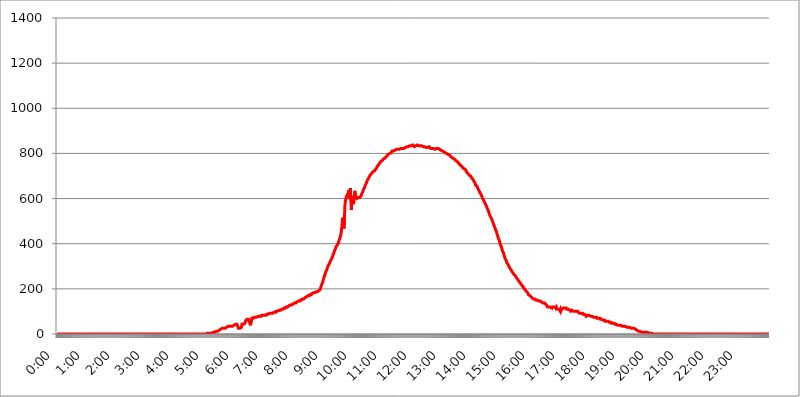
| Category | 2017.07.29. Intenzitás [W/m^2] |
|---|---|
| 0.0 | 0 |
| 0.0006944444444444445 | 0 |
| 0.001388888888888889 | 0 |
| 0.0020833333333333333 | 0 |
| 0.002777777777777778 | 0 |
| 0.003472222222222222 | 0 |
| 0.004166666666666667 | 0 |
| 0.004861111111111111 | 0 |
| 0.005555555555555556 | 0 |
| 0.0062499999999999995 | 0 |
| 0.006944444444444444 | 0 |
| 0.007638888888888889 | 0 |
| 0.008333333333333333 | 0 |
| 0.009027777777777779 | 0 |
| 0.009722222222222222 | 0 |
| 0.010416666666666666 | 0 |
| 0.011111111111111112 | 0 |
| 0.011805555555555555 | 0 |
| 0.012499999999999999 | 0 |
| 0.013194444444444444 | 0 |
| 0.013888888888888888 | 0 |
| 0.014583333333333332 | 0 |
| 0.015277777777777777 | 0 |
| 0.015972222222222224 | 0 |
| 0.016666666666666666 | 0 |
| 0.017361111111111112 | 0 |
| 0.018055555555555557 | 0 |
| 0.01875 | 0 |
| 0.019444444444444445 | 0 |
| 0.02013888888888889 | 0 |
| 0.020833333333333332 | 0 |
| 0.02152777777777778 | 0 |
| 0.022222222222222223 | 0 |
| 0.02291666666666667 | 0 |
| 0.02361111111111111 | 0 |
| 0.024305555555555556 | 0 |
| 0.024999999999999998 | 0 |
| 0.025694444444444447 | 0 |
| 0.02638888888888889 | 0 |
| 0.027083333333333334 | 0 |
| 0.027777777777777776 | 0 |
| 0.02847222222222222 | 0 |
| 0.029166666666666664 | 0 |
| 0.029861111111111113 | 0 |
| 0.030555555555555555 | 0 |
| 0.03125 | 0 |
| 0.03194444444444445 | 0 |
| 0.03263888888888889 | 0 |
| 0.03333333333333333 | 0 |
| 0.034027777777777775 | 0 |
| 0.034722222222222224 | 0 |
| 0.035416666666666666 | 0 |
| 0.036111111111111115 | 0 |
| 0.03680555555555556 | 0 |
| 0.0375 | 0 |
| 0.03819444444444444 | 0 |
| 0.03888888888888889 | 0 |
| 0.03958333333333333 | 0 |
| 0.04027777777777778 | 0 |
| 0.04097222222222222 | 0 |
| 0.041666666666666664 | 0 |
| 0.042361111111111106 | 0 |
| 0.04305555555555556 | 0 |
| 0.043750000000000004 | 0 |
| 0.044444444444444446 | 0 |
| 0.04513888888888889 | 0 |
| 0.04583333333333334 | 0 |
| 0.04652777777777778 | 0 |
| 0.04722222222222222 | 0 |
| 0.04791666666666666 | 0 |
| 0.04861111111111111 | 0 |
| 0.049305555555555554 | 0 |
| 0.049999999999999996 | 0 |
| 0.05069444444444445 | 0 |
| 0.051388888888888894 | 0 |
| 0.052083333333333336 | 0 |
| 0.05277777777777778 | 0 |
| 0.05347222222222222 | 0 |
| 0.05416666666666667 | 0 |
| 0.05486111111111111 | 0 |
| 0.05555555555555555 | 0 |
| 0.05625 | 0 |
| 0.05694444444444444 | 0 |
| 0.057638888888888885 | 0 |
| 0.05833333333333333 | 0 |
| 0.05902777777777778 | 0 |
| 0.059722222222222225 | 0 |
| 0.06041666666666667 | 0 |
| 0.061111111111111116 | 0 |
| 0.06180555555555556 | 0 |
| 0.0625 | 0 |
| 0.06319444444444444 | 0 |
| 0.06388888888888888 | 0 |
| 0.06458333333333334 | 0 |
| 0.06527777777777778 | 0 |
| 0.06597222222222222 | 0 |
| 0.06666666666666667 | 0 |
| 0.06736111111111111 | 0 |
| 0.06805555555555555 | 0 |
| 0.06874999999999999 | 0 |
| 0.06944444444444443 | 0 |
| 0.07013888888888889 | 0 |
| 0.07083333333333333 | 0 |
| 0.07152777777777779 | 0 |
| 0.07222222222222223 | 0 |
| 0.07291666666666667 | 0 |
| 0.07361111111111111 | 0 |
| 0.07430555555555556 | 0 |
| 0.075 | 0 |
| 0.07569444444444444 | 0 |
| 0.0763888888888889 | 0 |
| 0.07708333333333334 | 0 |
| 0.07777777777777778 | 0 |
| 0.07847222222222222 | 0 |
| 0.07916666666666666 | 0 |
| 0.0798611111111111 | 0 |
| 0.08055555555555556 | 0 |
| 0.08125 | 0 |
| 0.08194444444444444 | 0 |
| 0.08263888888888889 | 0 |
| 0.08333333333333333 | 0 |
| 0.08402777777777777 | 0 |
| 0.08472222222222221 | 0 |
| 0.08541666666666665 | 0 |
| 0.08611111111111112 | 0 |
| 0.08680555555555557 | 0 |
| 0.08750000000000001 | 0 |
| 0.08819444444444445 | 0 |
| 0.08888888888888889 | 0 |
| 0.08958333333333333 | 0 |
| 0.09027777777777778 | 0 |
| 0.09097222222222222 | 0 |
| 0.09166666666666667 | 0 |
| 0.09236111111111112 | 0 |
| 0.09305555555555556 | 0 |
| 0.09375 | 0 |
| 0.09444444444444444 | 0 |
| 0.09513888888888888 | 0 |
| 0.09583333333333333 | 0 |
| 0.09652777777777777 | 0 |
| 0.09722222222222222 | 0 |
| 0.09791666666666667 | 0 |
| 0.09861111111111111 | 0 |
| 0.09930555555555555 | 0 |
| 0.09999999999999999 | 0 |
| 0.10069444444444443 | 0 |
| 0.1013888888888889 | 0 |
| 0.10208333333333335 | 0 |
| 0.10277777777777779 | 0 |
| 0.10347222222222223 | 0 |
| 0.10416666666666667 | 0 |
| 0.10486111111111111 | 0 |
| 0.10555555555555556 | 0 |
| 0.10625 | 0 |
| 0.10694444444444444 | 0 |
| 0.1076388888888889 | 0 |
| 0.10833333333333334 | 0 |
| 0.10902777777777778 | 0 |
| 0.10972222222222222 | 0 |
| 0.1111111111111111 | 0 |
| 0.11180555555555556 | 0 |
| 0.11180555555555556 | 0 |
| 0.1125 | 0 |
| 0.11319444444444444 | 0 |
| 0.11388888888888889 | 0 |
| 0.11458333333333333 | 0 |
| 0.11527777777777777 | 0 |
| 0.11597222222222221 | 0 |
| 0.11666666666666665 | 0 |
| 0.1173611111111111 | 0 |
| 0.11805555555555557 | 0 |
| 0.11944444444444445 | 0 |
| 0.12013888888888889 | 0 |
| 0.12083333333333333 | 0 |
| 0.12152777777777778 | 0 |
| 0.12222222222222223 | 0 |
| 0.12291666666666667 | 0 |
| 0.12291666666666667 | 0 |
| 0.12361111111111112 | 0 |
| 0.12430555555555556 | 0 |
| 0.125 | 0 |
| 0.12569444444444444 | 0 |
| 0.12638888888888888 | 0 |
| 0.12708333333333333 | 0 |
| 0.16875 | 0 |
| 0.12847222222222224 | 0 |
| 0.12916666666666668 | 0 |
| 0.12986111111111112 | 0 |
| 0.13055555555555556 | 0 |
| 0.13125 | 0 |
| 0.13194444444444445 | 0 |
| 0.1326388888888889 | 0 |
| 0.13333333333333333 | 0 |
| 0.13402777777777777 | 0 |
| 0.13402777777777777 | 0 |
| 0.13472222222222222 | 0 |
| 0.13541666666666666 | 0 |
| 0.1361111111111111 | 0 |
| 0.13749999999999998 | 0 |
| 0.13819444444444443 | 0 |
| 0.1388888888888889 | 0 |
| 0.13958333333333334 | 0 |
| 0.14027777777777778 | 0 |
| 0.14097222222222222 | 0 |
| 0.14166666666666666 | 0 |
| 0.1423611111111111 | 0 |
| 0.14305555555555557 | 0 |
| 0.14375000000000002 | 0 |
| 0.14444444444444446 | 0 |
| 0.1451388888888889 | 0 |
| 0.1451388888888889 | 0 |
| 0.14652777777777778 | 0 |
| 0.14722222222222223 | 0 |
| 0.14791666666666667 | 0 |
| 0.1486111111111111 | 0 |
| 0.14930555555555555 | 0 |
| 0.15 | 0 |
| 0.15069444444444444 | 0 |
| 0.15138888888888888 | 0 |
| 0.15208333333333332 | 0 |
| 0.15277777777777776 | 0 |
| 0.15347222222222223 | 0 |
| 0.15416666666666667 | 0 |
| 0.15486111111111112 | 0 |
| 0.15555555555555556 | 0 |
| 0.15625 | 0 |
| 0.15694444444444444 | 0 |
| 0.15763888888888888 | 0 |
| 0.15833333333333333 | 0 |
| 0.15902777777777777 | 0 |
| 0.15972222222222224 | 0 |
| 0.16041666666666668 | 0 |
| 0.16111111111111112 | 0 |
| 0.16180555555555556 | 0 |
| 0.1625 | 0 |
| 0.16319444444444445 | 0 |
| 0.1638888888888889 | 0 |
| 0.16458333333333333 | 0 |
| 0.16527777777777777 | 0 |
| 0.16597222222222222 | 0 |
| 0.16666666666666666 | 0 |
| 0.1673611111111111 | 0 |
| 0.16805555555555554 | 0 |
| 0.16874999999999998 | 0 |
| 0.16944444444444443 | 0 |
| 0.17013888888888887 | 0 |
| 0.1708333333333333 | 0 |
| 0.17152777777777775 | 0 |
| 0.17222222222222225 | 0 |
| 0.1729166666666667 | 0 |
| 0.17361111111111113 | 0 |
| 0.17430555555555557 | 0 |
| 0.17500000000000002 | 0 |
| 0.17569444444444446 | 0 |
| 0.1763888888888889 | 0 |
| 0.17708333333333334 | 0 |
| 0.17777777777777778 | 0 |
| 0.17847222222222223 | 0 |
| 0.17916666666666667 | 0 |
| 0.1798611111111111 | 0 |
| 0.18055555555555555 | 0 |
| 0.18125 | 0 |
| 0.18194444444444444 | 0 |
| 0.1826388888888889 | 0 |
| 0.18333333333333335 | 0 |
| 0.1840277777777778 | 0 |
| 0.18472222222222223 | 0 |
| 0.18541666666666667 | 0 |
| 0.18611111111111112 | 0 |
| 0.18680555555555556 | 0 |
| 0.1875 | 0 |
| 0.18819444444444444 | 0 |
| 0.18888888888888888 | 0 |
| 0.18958333333333333 | 0 |
| 0.19027777777777777 | 0 |
| 0.1909722222222222 | 0 |
| 0.19166666666666665 | 0 |
| 0.19236111111111112 | 0 |
| 0.19305555555555554 | 0 |
| 0.19375 | 0 |
| 0.19444444444444445 | 0 |
| 0.1951388888888889 | 0 |
| 0.19583333333333333 | 0 |
| 0.19652777777777777 | 0 |
| 0.19722222222222222 | 0 |
| 0.19791666666666666 | 0 |
| 0.1986111111111111 | 0 |
| 0.19930555555555554 | 0 |
| 0.19999999999999998 | 0 |
| 0.20069444444444443 | 0 |
| 0.20138888888888887 | 0 |
| 0.2020833333333333 | 0 |
| 0.2027777777777778 | 0 |
| 0.2034722222222222 | 0 |
| 0.2041666666666667 | 0 |
| 0.20486111111111113 | 0 |
| 0.20555555555555557 | 0 |
| 0.20625000000000002 | 0 |
| 0.20694444444444446 | 0 |
| 0.2076388888888889 | 0 |
| 0.20833333333333334 | 0 |
| 0.20902777777777778 | 0 |
| 0.20972222222222223 | 3.525 |
| 0.21041666666666667 | 3.525 |
| 0.2111111111111111 | 3.525 |
| 0.21180555555555555 | 3.525 |
| 0.2125 | 3.525 |
| 0.21319444444444444 | 3.525 |
| 0.2138888888888889 | 3.525 |
| 0.21458333333333335 | 3.525 |
| 0.2152777777777778 | 3.525 |
| 0.21597222222222223 | 3.525 |
| 0.21666666666666667 | 3.525 |
| 0.21736111111111112 | 3.525 |
| 0.21805555555555556 | 3.525 |
| 0.21875 | 7.887 |
| 0.21944444444444444 | 7.887 |
| 0.22013888888888888 | 7.887 |
| 0.22083333333333333 | 7.887 |
| 0.22152777777777777 | 12.257 |
| 0.2222222222222222 | 12.257 |
| 0.22291666666666665 | 12.257 |
| 0.2236111111111111 | 12.257 |
| 0.22430555555555556 | 12.257 |
| 0.225 | 12.257 |
| 0.22569444444444445 | 16.636 |
| 0.2263888888888889 | 16.636 |
| 0.22708333333333333 | 16.636 |
| 0.22777777777777777 | 16.636 |
| 0.22847222222222222 | 21.024 |
| 0.22916666666666666 | 21.024 |
| 0.2298611111111111 | 21.024 |
| 0.23055555555555554 | 21.024 |
| 0.23124999999999998 | 25.419 |
| 0.23194444444444443 | 25.419 |
| 0.23263888888888887 | 25.419 |
| 0.2333333333333333 | 25.419 |
| 0.2340277777777778 | 25.419 |
| 0.2347222222222222 | 25.419 |
| 0.2354166666666667 | 25.419 |
| 0.23611111111111113 | 25.419 |
| 0.23680555555555557 | 25.419 |
| 0.23750000000000002 | 29.823 |
| 0.23819444444444446 | 34.234 |
| 0.2388888888888889 | 34.234 |
| 0.23958333333333334 | 34.234 |
| 0.24027777777777778 | 34.234 |
| 0.24097222222222223 | 34.234 |
| 0.24166666666666667 | 34.234 |
| 0.2423611111111111 | 34.234 |
| 0.24305555555555555 | 34.234 |
| 0.24375 | 34.234 |
| 0.24444444444444446 | 34.234 |
| 0.24513888888888888 | 34.234 |
| 0.24583333333333335 | 34.234 |
| 0.2465277777777778 | 38.653 |
| 0.24722222222222223 | 38.653 |
| 0.24791666666666667 | 38.653 |
| 0.24861111111111112 | 43.079 |
| 0.24930555555555556 | 43.079 |
| 0.25 | 43.079 |
| 0.25069444444444444 | 43.079 |
| 0.2513888888888889 | 43.079 |
| 0.2520833333333333 | 43.079 |
| 0.25277777777777777 | 43.079 |
| 0.2534722222222222 | 43.079 |
| 0.25416666666666665 | 25.419 |
| 0.2548611111111111 | 21.024 |
| 0.2555555555555556 | 21.024 |
| 0.25625000000000003 | 25.419 |
| 0.2569444444444445 | 21.024 |
| 0.2576388888888889 | 29.823 |
| 0.25833333333333336 | 29.823 |
| 0.2590277777777778 | 43.079 |
| 0.25972222222222224 | 38.653 |
| 0.2604166666666667 | 43.079 |
| 0.2611111111111111 | 43.079 |
| 0.26180555555555557 | 38.653 |
| 0.2625 | 38.653 |
| 0.26319444444444445 | 47.511 |
| 0.2638888888888889 | 56.398 |
| 0.26458333333333334 | 56.398 |
| 0.2652777777777778 | 56.398 |
| 0.2659722222222222 | 65.31 |
| 0.26666666666666666 | 65.31 |
| 0.2673611111111111 | 65.31 |
| 0.26805555555555555 | 65.31 |
| 0.26875 | 65.31 |
| 0.26944444444444443 | 65.31 |
| 0.2701388888888889 | 47.511 |
| 0.2708333333333333 | 38.653 |
| 0.27152777777777776 | 38.653 |
| 0.2722222222222222 | 56.398 |
| 0.27291666666666664 | 69.775 |
| 0.2736111111111111 | 69.775 |
| 0.2743055555555555 | 69.775 |
| 0.27499999999999997 | 69.775 |
| 0.27569444444444446 | 74.246 |
| 0.27638888888888885 | 74.246 |
| 0.27708333333333335 | 74.246 |
| 0.2777777777777778 | 74.246 |
| 0.27847222222222223 | 74.246 |
| 0.2791666666666667 | 74.246 |
| 0.2798611111111111 | 74.246 |
| 0.28055555555555556 | 74.246 |
| 0.28125 | 74.246 |
| 0.28194444444444444 | 78.722 |
| 0.2826388888888889 | 78.722 |
| 0.2833333333333333 | 78.722 |
| 0.28402777777777777 | 78.722 |
| 0.2847222222222222 | 78.722 |
| 0.28541666666666665 | 78.722 |
| 0.28611111111111115 | 78.722 |
| 0.28680555555555554 | 83.205 |
| 0.28750000000000003 | 83.205 |
| 0.2881944444444445 | 83.205 |
| 0.2888888888888889 | 83.205 |
| 0.28958333333333336 | 83.205 |
| 0.2902777777777778 | 83.205 |
| 0.29097222222222224 | 83.205 |
| 0.2916666666666667 | 83.205 |
| 0.2923611111111111 | 83.205 |
| 0.29305555555555557 | 83.205 |
| 0.29375 | 87.692 |
| 0.29444444444444445 | 87.692 |
| 0.2951388888888889 | 87.692 |
| 0.29583333333333334 | 87.692 |
| 0.2965277777777778 | 87.692 |
| 0.2972222222222222 | 87.692 |
| 0.29791666666666666 | 92.184 |
| 0.2986111111111111 | 92.184 |
| 0.29930555555555555 | 92.184 |
| 0.3 | 92.184 |
| 0.30069444444444443 | 92.184 |
| 0.3013888888888889 | 92.184 |
| 0.3020833333333333 | 92.184 |
| 0.30277777777777776 | 92.184 |
| 0.3034722222222222 | 92.184 |
| 0.30416666666666664 | 96.682 |
| 0.3048611111111111 | 96.682 |
| 0.3055555555555555 | 96.682 |
| 0.30624999999999997 | 96.682 |
| 0.3069444444444444 | 101.184 |
| 0.3076388888888889 | 101.184 |
| 0.30833333333333335 | 101.184 |
| 0.3090277777777778 | 101.184 |
| 0.30972222222222223 | 101.184 |
| 0.3104166666666667 | 101.184 |
| 0.3111111111111111 | 105.69 |
| 0.31180555555555556 | 105.69 |
| 0.3125 | 105.69 |
| 0.31319444444444444 | 105.69 |
| 0.3138888888888889 | 105.69 |
| 0.3145833333333333 | 110.201 |
| 0.31527777777777777 | 110.201 |
| 0.3159722222222222 | 110.201 |
| 0.31666666666666665 | 110.201 |
| 0.31736111111111115 | 110.201 |
| 0.31805555555555554 | 114.716 |
| 0.31875000000000003 | 114.716 |
| 0.3194444444444445 | 114.716 |
| 0.3201388888888889 | 114.716 |
| 0.32083333333333336 | 119.235 |
| 0.3215277777777778 | 119.235 |
| 0.32222222222222224 | 119.235 |
| 0.3229166666666667 | 119.235 |
| 0.3236111111111111 | 119.235 |
| 0.32430555555555557 | 123.758 |
| 0.325 | 123.758 |
| 0.32569444444444445 | 123.758 |
| 0.3263888888888889 | 128.284 |
| 0.32708333333333334 | 128.284 |
| 0.3277777777777778 | 128.284 |
| 0.3284722222222222 | 128.284 |
| 0.32916666666666666 | 128.284 |
| 0.3298611111111111 | 128.284 |
| 0.33055555555555555 | 132.814 |
| 0.33125 | 132.814 |
| 0.33194444444444443 | 132.814 |
| 0.3326388888888889 | 137.347 |
| 0.3333333333333333 | 137.347 |
| 0.3340277777777778 | 137.347 |
| 0.3347222222222222 | 137.347 |
| 0.3354166666666667 | 137.347 |
| 0.3361111111111111 | 141.884 |
| 0.3368055555555556 | 141.884 |
| 0.33749999999999997 | 141.884 |
| 0.33819444444444446 | 146.423 |
| 0.33888888888888885 | 146.423 |
| 0.33958333333333335 | 146.423 |
| 0.34027777777777773 | 146.423 |
| 0.34097222222222223 | 150.964 |
| 0.3416666666666666 | 150.964 |
| 0.3423611111111111 | 150.964 |
| 0.3430555555555555 | 150.964 |
| 0.34375 | 155.509 |
| 0.3444444444444445 | 155.509 |
| 0.3451388888888889 | 155.509 |
| 0.3458333333333334 | 155.509 |
| 0.34652777777777777 | 155.509 |
| 0.34722222222222227 | 160.056 |
| 0.34791666666666665 | 160.056 |
| 0.34861111111111115 | 160.056 |
| 0.34930555555555554 | 164.605 |
| 0.35000000000000003 | 164.605 |
| 0.3506944444444444 | 164.605 |
| 0.3513888888888889 | 169.156 |
| 0.3520833333333333 | 169.156 |
| 0.3527777777777778 | 169.156 |
| 0.3534722222222222 | 169.156 |
| 0.3541666666666667 | 173.709 |
| 0.3548611111111111 | 173.709 |
| 0.35555555555555557 | 173.709 |
| 0.35625 | 173.709 |
| 0.35694444444444445 | 178.264 |
| 0.3576388888888889 | 178.264 |
| 0.35833333333333334 | 178.264 |
| 0.3590277777777778 | 182.82 |
| 0.3597222222222222 | 182.82 |
| 0.36041666666666666 | 182.82 |
| 0.3611111111111111 | 182.82 |
| 0.36180555555555555 | 182.82 |
| 0.3625 | 182.82 |
| 0.36319444444444443 | 187.378 |
| 0.3638888888888889 | 187.378 |
| 0.3645833333333333 | 187.378 |
| 0.3652777777777778 | 187.378 |
| 0.3659722222222222 | 187.378 |
| 0.3666666666666667 | 191.937 |
| 0.3673611111111111 | 191.937 |
| 0.3680555555555556 | 191.937 |
| 0.36874999999999997 | 196.497 |
| 0.36944444444444446 | 205.62 |
| 0.37013888888888885 | 210.182 |
| 0.37083333333333335 | 219.309 |
| 0.37152777777777773 | 223.873 |
| 0.37222222222222223 | 228.436 |
| 0.3729166666666666 | 237.564 |
| 0.3736111111111111 | 246.689 |
| 0.3743055555555555 | 251.251 |
| 0.375 | 260.373 |
| 0.3756944444444445 | 264.932 |
| 0.3763888888888889 | 274.047 |
| 0.3770833333333334 | 278.603 |
| 0.37777777777777777 | 283.156 |
| 0.37847222222222227 | 287.709 |
| 0.37916666666666665 | 296.808 |
| 0.37986111111111115 | 301.354 |
| 0.38055555555555554 | 305.898 |
| 0.38125000000000003 | 310.44 |
| 0.3819444444444444 | 314.98 |
| 0.3826388888888889 | 319.517 |
| 0.3833333333333333 | 324.052 |
| 0.3840277777777778 | 328.584 |
| 0.3847222222222222 | 333.113 |
| 0.3854166666666667 | 337.639 |
| 0.3861111111111111 | 342.162 |
| 0.38680555555555557 | 351.198 |
| 0.3875 | 355.712 |
| 0.38819444444444445 | 360.221 |
| 0.3888888888888889 | 369.23 |
| 0.38958333333333334 | 373.729 |
| 0.3902777777777778 | 378.224 |
| 0.3909722222222222 | 387.202 |
| 0.39166666666666666 | 387.202 |
| 0.3923611111111111 | 391.685 |
| 0.39305555555555555 | 396.164 |
| 0.39375 | 400.638 |
| 0.39444444444444443 | 405.108 |
| 0.3951388888888889 | 414.035 |
| 0.3958333333333333 | 418.492 |
| 0.3965277777777778 | 427.39 |
| 0.3972222222222222 | 431.833 |
| 0.3979166666666667 | 445.129 |
| 0.3986111111111111 | 458.38 |
| 0.3993055555555556 | 480.356 |
| 0.39999999999999997 | 506.542 |
| 0.40069444444444446 | 515.223 |
| 0.40138888888888885 | 493.475 |
| 0.40208333333333335 | 467.187 |
| 0.40277777777777773 | 510.885 |
| 0.40347222222222223 | 571.049 |
| 0.4041666666666666 | 588.009 |
| 0.4048611111111111 | 600.661 |
| 0.4055555555555555 | 609.062 |
| 0.40625 | 609.062 |
| 0.4069444444444445 | 617.436 |
| 0.4076388888888889 | 621.613 |
| 0.4083333333333334 | 625.784 |
| 0.40902777777777777 | 638.256 |
| 0.40972222222222227 | 600.661 |
| 0.41041666666666665 | 625.784 |
| 0.41111111111111115 | 646.537 |
| 0.41180555555555554 | 592.233 |
| 0.41250000000000003 | 549.704 |
| 0.4131944444444444 | 592.233 |
| 0.4138888888888889 | 609.062 |
| 0.4145833333333333 | 609.062 |
| 0.4152777777777778 | 575.299 |
| 0.4159722222222222 | 588.009 |
| 0.4166666666666667 | 604.864 |
| 0.4173611111111111 | 634.105 |
| 0.41805555555555557 | 617.436 |
| 0.41875 | 609.062 |
| 0.41944444444444445 | 604.864 |
| 0.4201388888888889 | 600.661 |
| 0.42083333333333334 | 604.864 |
| 0.4215277777777778 | 604.864 |
| 0.4222222222222222 | 604.864 |
| 0.42291666666666666 | 600.661 |
| 0.4236111111111111 | 600.661 |
| 0.42430555555555555 | 604.864 |
| 0.425 | 609.062 |
| 0.42569444444444443 | 609.062 |
| 0.4263888888888889 | 613.252 |
| 0.4270833333333333 | 621.613 |
| 0.4277777777777778 | 625.784 |
| 0.4284722222222222 | 629.948 |
| 0.4291666666666667 | 634.105 |
| 0.4298611111111111 | 642.4 |
| 0.4305555555555556 | 646.537 |
| 0.43124999999999997 | 650.667 |
| 0.43194444444444446 | 658.909 |
| 0.43263888888888885 | 663.019 |
| 0.43333333333333335 | 667.123 |
| 0.43402777777777773 | 671.22 |
| 0.43472222222222223 | 679.395 |
| 0.4354166666666666 | 683.473 |
| 0.4361111111111111 | 687.544 |
| 0.4368055555555555 | 691.608 |
| 0.4375 | 695.666 |
| 0.4381944444444445 | 699.717 |
| 0.4388888888888889 | 703.762 |
| 0.4395833333333334 | 707.8 |
| 0.44027777777777777 | 707.8 |
| 0.44097222222222227 | 711.832 |
| 0.44166666666666665 | 711.832 |
| 0.44236111111111115 | 715.858 |
| 0.44305555555555554 | 719.877 |
| 0.44375000000000003 | 723.889 |
| 0.4444444444444444 | 723.889 |
| 0.4451388888888889 | 723.889 |
| 0.4458333333333333 | 727.896 |
| 0.4465277777777778 | 727.896 |
| 0.4472222222222222 | 731.896 |
| 0.4479166666666667 | 735.89 |
| 0.4486111111111111 | 739.877 |
| 0.44930555555555557 | 743.859 |
| 0.45 | 747.834 |
| 0.45069444444444445 | 747.834 |
| 0.4513888888888889 | 751.803 |
| 0.45208333333333334 | 755.766 |
| 0.4527777777777778 | 759.723 |
| 0.4534722222222222 | 763.674 |
| 0.45416666666666666 | 767.62 |
| 0.4548611111111111 | 767.62 |
| 0.45555555555555555 | 767.62 |
| 0.45625 | 771.559 |
| 0.45694444444444443 | 771.559 |
| 0.4576388888888889 | 775.492 |
| 0.4583333333333333 | 775.492 |
| 0.4590277777777778 | 779.42 |
| 0.4597222222222222 | 779.42 |
| 0.4604166666666667 | 783.342 |
| 0.4611111111111111 | 783.342 |
| 0.4618055555555556 | 787.258 |
| 0.46249999999999997 | 791.169 |
| 0.46319444444444446 | 791.169 |
| 0.46388888888888885 | 795.074 |
| 0.46458333333333335 | 798.974 |
| 0.46527777777777773 | 795.074 |
| 0.46597222222222223 | 798.974 |
| 0.4666666666666666 | 798.974 |
| 0.4673611111111111 | 798.974 |
| 0.4680555555555555 | 802.868 |
| 0.46875 | 806.757 |
| 0.4694444444444445 | 810.641 |
| 0.4701388888888889 | 810.641 |
| 0.4708333333333334 | 810.641 |
| 0.47152777777777777 | 810.641 |
| 0.47222222222222227 | 810.641 |
| 0.47291666666666665 | 814.519 |
| 0.47361111111111115 | 814.519 |
| 0.47430555555555554 | 814.519 |
| 0.47500000000000003 | 818.392 |
| 0.4756944444444444 | 818.392 |
| 0.4763888888888889 | 818.392 |
| 0.4770833333333333 | 818.392 |
| 0.4777777777777778 | 818.392 |
| 0.4784722222222222 | 818.392 |
| 0.4791666666666667 | 818.392 |
| 0.4798611111111111 | 818.392 |
| 0.48055555555555557 | 822.26 |
| 0.48125 | 822.26 |
| 0.48194444444444445 | 822.26 |
| 0.4826388888888889 | 822.26 |
| 0.48333333333333334 | 822.26 |
| 0.4840277777777778 | 822.26 |
| 0.4847222222222222 | 822.26 |
| 0.48541666666666666 | 822.26 |
| 0.4861111111111111 | 822.26 |
| 0.48680555555555555 | 826.123 |
| 0.4875 | 826.123 |
| 0.48819444444444443 | 826.123 |
| 0.4888888888888889 | 829.981 |
| 0.4895833333333333 | 829.981 |
| 0.4902777777777778 | 829.981 |
| 0.4909722222222222 | 829.981 |
| 0.4916666666666667 | 829.981 |
| 0.4923611111111111 | 829.981 |
| 0.4930555555555556 | 829.981 |
| 0.49374999999999997 | 833.834 |
| 0.49444444444444446 | 833.834 |
| 0.49513888888888885 | 833.834 |
| 0.49583333333333335 | 833.834 |
| 0.49652777777777773 | 833.834 |
| 0.49722222222222223 | 833.834 |
| 0.4979166666666666 | 833.834 |
| 0.4986111111111111 | 837.682 |
| 0.4993055555555555 | 833.834 |
| 0.5 | 833.834 |
| 0.5006944444444444 | 829.981 |
| 0.5013888888888889 | 829.981 |
| 0.5020833333333333 | 833.834 |
| 0.5027777777777778 | 833.834 |
| 0.5034722222222222 | 829.981 |
| 0.5041666666666667 | 833.834 |
| 0.5048611111111111 | 837.682 |
| 0.5055555555555555 | 837.682 |
| 0.50625 | 837.682 |
| 0.5069444444444444 | 833.834 |
| 0.5076388888888889 | 833.834 |
| 0.5083333333333333 | 833.834 |
| 0.5090277777777777 | 833.834 |
| 0.5097222222222222 | 833.834 |
| 0.5104166666666666 | 833.834 |
| 0.5111111111111112 | 833.834 |
| 0.5118055555555555 | 833.834 |
| 0.5125000000000001 | 829.981 |
| 0.5131944444444444 | 829.981 |
| 0.513888888888889 | 829.981 |
| 0.5145833333333333 | 833.834 |
| 0.5152777777777778 | 829.981 |
| 0.5159722222222222 | 829.981 |
| 0.5166666666666667 | 829.981 |
| 0.517361111111111 | 826.123 |
| 0.5180555555555556 | 826.123 |
| 0.5187499999999999 | 826.123 |
| 0.5194444444444445 | 826.123 |
| 0.5201388888888888 | 829.981 |
| 0.5208333333333334 | 829.981 |
| 0.5215277777777778 | 829.981 |
| 0.5222222222222223 | 829.981 |
| 0.5229166666666667 | 826.123 |
| 0.5236111111111111 | 822.26 |
| 0.5243055555555556 | 822.26 |
| 0.525 | 822.26 |
| 0.5256944444444445 | 822.26 |
| 0.5263888888888889 | 822.26 |
| 0.5270833333333333 | 822.26 |
| 0.5277777777777778 | 822.26 |
| 0.5284722222222222 | 822.26 |
| 0.5291666666666667 | 818.392 |
| 0.5298611111111111 | 818.392 |
| 0.5305555555555556 | 818.392 |
| 0.53125 | 822.26 |
| 0.5319444444444444 | 822.26 |
| 0.5326388888888889 | 822.26 |
| 0.5333333333333333 | 822.26 |
| 0.5340277777777778 | 822.26 |
| 0.5347222222222222 | 822.26 |
| 0.5354166666666667 | 818.392 |
| 0.5361111111111111 | 818.392 |
| 0.5368055555555555 | 818.392 |
| 0.5375 | 818.392 |
| 0.5381944444444444 | 814.519 |
| 0.5388888888888889 | 814.519 |
| 0.5395833333333333 | 810.641 |
| 0.5402777777777777 | 810.641 |
| 0.5409722222222222 | 810.641 |
| 0.5416666666666666 | 810.641 |
| 0.5423611111111112 | 806.757 |
| 0.5430555555555555 | 806.757 |
| 0.5437500000000001 | 806.757 |
| 0.5444444444444444 | 802.868 |
| 0.545138888888889 | 798.974 |
| 0.5458333333333333 | 802.868 |
| 0.5465277777777778 | 798.974 |
| 0.5472222222222222 | 798.974 |
| 0.5479166666666667 | 798.974 |
| 0.548611111111111 | 795.074 |
| 0.5493055555555556 | 795.074 |
| 0.5499999999999999 | 791.169 |
| 0.5506944444444445 | 791.169 |
| 0.5513888888888888 | 787.258 |
| 0.5520833333333334 | 787.258 |
| 0.5527777777777778 | 783.342 |
| 0.5534722222222223 | 783.342 |
| 0.5541666666666667 | 783.342 |
| 0.5548611111111111 | 779.42 |
| 0.5555555555555556 | 775.492 |
| 0.55625 | 775.492 |
| 0.5569444444444445 | 775.492 |
| 0.5576388888888889 | 771.559 |
| 0.5583333333333333 | 771.559 |
| 0.5590277777777778 | 767.62 |
| 0.5597222222222222 | 767.62 |
| 0.5604166666666667 | 767.62 |
| 0.5611111111111111 | 763.674 |
| 0.5618055555555556 | 759.723 |
| 0.5625 | 759.723 |
| 0.5631944444444444 | 755.766 |
| 0.5638888888888889 | 751.803 |
| 0.5645833333333333 | 751.803 |
| 0.5652777777777778 | 747.834 |
| 0.5659722222222222 | 747.834 |
| 0.5666666666666667 | 743.859 |
| 0.5673611111111111 | 743.859 |
| 0.5680555555555555 | 739.877 |
| 0.56875 | 735.89 |
| 0.5694444444444444 | 735.89 |
| 0.5701388888888889 | 735.89 |
| 0.5708333333333333 | 731.896 |
| 0.5715277777777777 | 731.896 |
| 0.5722222222222222 | 727.896 |
| 0.5729166666666666 | 727.896 |
| 0.5736111111111112 | 719.877 |
| 0.5743055555555555 | 719.877 |
| 0.5750000000000001 | 715.858 |
| 0.5756944444444444 | 711.832 |
| 0.576388888888889 | 711.832 |
| 0.5770833333333333 | 707.8 |
| 0.5777777777777778 | 703.762 |
| 0.5784722222222222 | 703.762 |
| 0.5791666666666667 | 699.717 |
| 0.579861111111111 | 699.717 |
| 0.5805555555555556 | 695.666 |
| 0.5812499999999999 | 691.608 |
| 0.5819444444444445 | 687.544 |
| 0.5826388888888888 | 687.544 |
| 0.5833333333333334 | 683.473 |
| 0.5840277777777778 | 679.395 |
| 0.5847222222222223 | 675.311 |
| 0.5854166666666667 | 671.22 |
| 0.5861111111111111 | 667.123 |
| 0.5868055555555556 | 658.909 |
| 0.5875 | 658.909 |
| 0.5881944444444445 | 658.909 |
| 0.5888888888888889 | 654.791 |
| 0.5895833333333333 | 646.537 |
| 0.5902777777777778 | 642.4 |
| 0.5909722222222222 | 638.256 |
| 0.5916666666666667 | 634.105 |
| 0.5923611111111111 | 629.948 |
| 0.5930555555555556 | 625.784 |
| 0.59375 | 621.613 |
| 0.5944444444444444 | 621.613 |
| 0.5951388888888889 | 613.252 |
| 0.5958333333333333 | 609.062 |
| 0.5965277777777778 | 600.661 |
| 0.5972222222222222 | 600.661 |
| 0.5979166666666667 | 596.45 |
| 0.5986111111111111 | 588.009 |
| 0.5993055555555555 | 583.779 |
| 0.6 | 579.542 |
| 0.6006944444444444 | 575.299 |
| 0.6013888888888889 | 571.049 |
| 0.6020833333333333 | 566.793 |
| 0.6027777777777777 | 558.261 |
| 0.6034722222222222 | 553.986 |
| 0.6041666666666666 | 549.704 |
| 0.6048611111111112 | 545.416 |
| 0.6055555555555555 | 536.82 |
| 0.6062500000000001 | 532.513 |
| 0.6069444444444444 | 523.88 |
| 0.607638888888889 | 519.555 |
| 0.6083333333333333 | 515.223 |
| 0.6090277777777778 | 510.885 |
| 0.6097222222222222 | 506.542 |
| 0.6104166666666667 | 497.836 |
| 0.611111111111111 | 493.475 |
| 0.6118055555555556 | 489.108 |
| 0.6124999999999999 | 480.356 |
| 0.6131944444444445 | 475.972 |
| 0.6138888888888888 | 471.582 |
| 0.6145833333333334 | 462.786 |
| 0.6152777777777778 | 458.38 |
| 0.6159722222222223 | 453.968 |
| 0.6166666666666667 | 445.129 |
| 0.6173611111111111 | 436.27 |
| 0.6180555555555556 | 431.833 |
| 0.61875 | 422.943 |
| 0.6194444444444445 | 418.492 |
| 0.6201388888888889 | 414.035 |
| 0.6208333333333333 | 405.108 |
| 0.6215277777777778 | 396.164 |
| 0.6222222222222222 | 391.685 |
| 0.6229166666666667 | 387.202 |
| 0.6236111111111111 | 378.224 |
| 0.6243055555555556 | 369.23 |
| 0.625 | 364.728 |
| 0.6256944444444444 | 360.221 |
| 0.6263888888888889 | 351.198 |
| 0.6270833333333333 | 346.682 |
| 0.6277777777777778 | 337.639 |
| 0.6284722222222222 | 333.113 |
| 0.6291666666666667 | 328.584 |
| 0.6298611111111111 | 324.052 |
| 0.6305555555555555 | 314.98 |
| 0.63125 | 314.98 |
| 0.6319444444444444 | 310.44 |
| 0.6326388888888889 | 305.898 |
| 0.6333333333333333 | 301.354 |
| 0.6340277777777777 | 296.808 |
| 0.6347222222222222 | 292.259 |
| 0.6354166666666666 | 287.709 |
| 0.6361111111111112 | 287.709 |
| 0.6368055555555555 | 283.156 |
| 0.6375000000000001 | 278.603 |
| 0.6381944444444444 | 274.047 |
| 0.638888888888889 | 274.047 |
| 0.6395833333333333 | 269.49 |
| 0.6402777777777778 | 264.932 |
| 0.6409722222222222 | 264.932 |
| 0.6416666666666667 | 260.373 |
| 0.642361111111111 | 260.373 |
| 0.6430555555555556 | 255.813 |
| 0.6437499999999999 | 251.251 |
| 0.6444444444444445 | 246.689 |
| 0.6451388888888888 | 246.689 |
| 0.6458333333333334 | 242.127 |
| 0.6465277777777778 | 237.564 |
| 0.6472222222222223 | 237.564 |
| 0.6479166666666667 | 233 |
| 0.6486111111111111 | 228.436 |
| 0.6493055555555556 | 228.436 |
| 0.65 | 223.873 |
| 0.6506944444444445 | 219.309 |
| 0.6513888888888889 | 219.309 |
| 0.6520833333333333 | 214.746 |
| 0.6527777777777778 | 210.182 |
| 0.6534722222222222 | 210.182 |
| 0.6541666666666667 | 205.62 |
| 0.6548611111111111 | 201.058 |
| 0.6555555555555556 | 201.058 |
| 0.65625 | 196.497 |
| 0.6569444444444444 | 191.937 |
| 0.6576388888888889 | 191.937 |
| 0.6583333333333333 | 187.378 |
| 0.6590277777777778 | 187.378 |
| 0.6597222222222222 | 182.82 |
| 0.6604166666666667 | 178.264 |
| 0.6611111111111111 | 173.709 |
| 0.6618055555555555 | 173.709 |
| 0.6625 | 173.709 |
| 0.6631944444444444 | 169.156 |
| 0.6638888888888889 | 169.156 |
| 0.6645833333333333 | 164.605 |
| 0.6652777777777777 | 164.605 |
| 0.6659722222222222 | 160.056 |
| 0.6666666666666666 | 160.056 |
| 0.6673611111111111 | 155.509 |
| 0.6680555555555556 | 155.509 |
| 0.6687500000000001 | 155.509 |
| 0.6694444444444444 | 155.509 |
| 0.6701388888888888 | 155.509 |
| 0.6708333333333334 | 150.964 |
| 0.6715277777777778 | 150.964 |
| 0.6722222222222222 | 150.964 |
| 0.6729166666666666 | 150.964 |
| 0.6736111111111112 | 150.964 |
| 0.6743055555555556 | 150.964 |
| 0.6749999999999999 | 146.423 |
| 0.6756944444444444 | 146.423 |
| 0.6763888888888889 | 146.423 |
| 0.6770833333333334 | 146.423 |
| 0.6777777777777777 | 146.423 |
| 0.6784722222222223 | 146.423 |
| 0.6791666666666667 | 141.884 |
| 0.6798611111111111 | 141.884 |
| 0.6805555555555555 | 141.884 |
| 0.68125 | 137.347 |
| 0.6819444444444445 | 137.347 |
| 0.6826388888888889 | 137.347 |
| 0.6833333333333332 | 137.347 |
| 0.6840277777777778 | 137.347 |
| 0.6847222222222222 | 132.814 |
| 0.6854166666666667 | 132.814 |
| 0.686111111111111 | 128.284 |
| 0.6868055555555556 | 123.758 |
| 0.6875 | 119.235 |
| 0.6881944444444444 | 119.235 |
| 0.688888888888889 | 119.235 |
| 0.6895833333333333 | 119.235 |
| 0.6902777777777778 | 119.235 |
| 0.6909722222222222 | 119.235 |
| 0.6916666666666668 | 119.235 |
| 0.6923611111111111 | 119.235 |
| 0.6930555555555555 | 119.235 |
| 0.69375 | 114.716 |
| 0.6944444444444445 | 119.235 |
| 0.6951388888888889 | 119.235 |
| 0.6958333333333333 | 119.235 |
| 0.6965277777777777 | 119.235 |
| 0.6972222222222223 | 119.235 |
| 0.6979166666666666 | 119.235 |
| 0.6986111111111111 | 119.235 |
| 0.6993055555555556 | 114.716 |
| 0.7000000000000001 | 119.235 |
| 0.7006944444444444 | 114.716 |
| 0.7013888888888888 | 114.716 |
| 0.7020833333333334 | 110.201 |
| 0.7027777777777778 | 110.201 |
| 0.7034722222222222 | 110.201 |
| 0.7041666666666666 | 110.201 |
| 0.7048611111111112 | 110.201 |
| 0.7055555555555556 | 101.184 |
| 0.7062499999999999 | 110.201 |
| 0.7069444444444444 | 105.69 |
| 0.7076388888888889 | 110.201 |
| 0.7083333333333334 | 110.201 |
| 0.7090277777777777 | 110.201 |
| 0.7097222222222223 | 114.716 |
| 0.7104166666666667 | 114.716 |
| 0.7111111111111111 | 114.716 |
| 0.7118055555555555 | 114.716 |
| 0.7125 | 114.716 |
| 0.7131944444444445 | 114.716 |
| 0.7138888888888889 | 114.716 |
| 0.7145833333333332 | 110.201 |
| 0.7152777777777778 | 110.201 |
| 0.7159722222222222 | 110.201 |
| 0.7166666666666667 | 110.201 |
| 0.717361111111111 | 110.201 |
| 0.7180555555555556 | 110.201 |
| 0.71875 | 105.69 |
| 0.7194444444444444 | 105.69 |
| 0.720138888888889 | 101.184 |
| 0.7208333333333333 | 101.184 |
| 0.7215277777777778 | 105.69 |
| 0.7222222222222222 | 105.69 |
| 0.7229166666666668 | 105.69 |
| 0.7236111111111111 | 101.184 |
| 0.7243055555555555 | 101.184 |
| 0.725 | 101.184 |
| 0.7256944444444445 | 101.184 |
| 0.7263888888888889 | 101.184 |
| 0.7270833333333333 | 101.184 |
| 0.7277777777777777 | 101.184 |
| 0.7284722222222223 | 101.184 |
| 0.7291666666666666 | 101.184 |
| 0.7298611111111111 | 101.184 |
| 0.7305555555555556 | 96.682 |
| 0.7312500000000001 | 96.682 |
| 0.7319444444444444 | 96.682 |
| 0.7326388888888888 | 92.184 |
| 0.7333333333333334 | 92.184 |
| 0.7340277777777778 | 92.184 |
| 0.7347222222222222 | 92.184 |
| 0.7354166666666666 | 92.184 |
| 0.7361111111111112 | 92.184 |
| 0.7368055555555556 | 92.184 |
| 0.7374999999999999 | 87.692 |
| 0.7381944444444444 | 87.692 |
| 0.7388888888888889 | 87.692 |
| 0.7395833333333334 | 87.692 |
| 0.7402777777777777 | 87.692 |
| 0.7409722222222223 | 83.205 |
| 0.7416666666666667 | 78.722 |
| 0.7423611111111111 | 78.722 |
| 0.7430555555555555 | 78.722 |
| 0.74375 | 83.205 |
| 0.7444444444444445 | 83.205 |
| 0.7451388888888889 | 83.205 |
| 0.7458333333333332 | 83.205 |
| 0.7465277777777778 | 83.205 |
| 0.7472222222222222 | 83.205 |
| 0.7479166666666667 | 78.722 |
| 0.748611111111111 | 78.722 |
| 0.7493055555555556 | 78.722 |
| 0.75 | 78.722 |
| 0.7506944444444444 | 78.722 |
| 0.751388888888889 | 78.722 |
| 0.7520833333333333 | 74.246 |
| 0.7527777777777778 | 74.246 |
| 0.7534722222222222 | 74.246 |
| 0.7541666666666668 | 74.246 |
| 0.7548611111111111 | 74.246 |
| 0.7555555555555555 | 74.246 |
| 0.75625 | 74.246 |
| 0.7569444444444445 | 69.775 |
| 0.7576388888888889 | 69.775 |
| 0.7583333333333333 | 69.775 |
| 0.7590277777777777 | 69.775 |
| 0.7597222222222223 | 69.775 |
| 0.7604166666666666 | 69.775 |
| 0.7611111111111111 | 69.775 |
| 0.7618055555555556 | 65.31 |
| 0.7625000000000001 | 65.31 |
| 0.7631944444444444 | 65.31 |
| 0.7638888888888888 | 65.31 |
| 0.7645833333333334 | 65.31 |
| 0.7652777777777778 | 65.31 |
| 0.7659722222222222 | 60.85 |
| 0.7666666666666666 | 60.85 |
| 0.7673611111111112 | 60.85 |
| 0.7680555555555556 | 60.85 |
| 0.7687499999999999 | 56.398 |
| 0.7694444444444444 | 56.398 |
| 0.7701388888888889 | 56.398 |
| 0.7708333333333334 | 56.398 |
| 0.7715277777777777 | 56.398 |
| 0.7722222222222223 | 56.398 |
| 0.7729166666666667 | 56.398 |
| 0.7736111111111111 | 56.398 |
| 0.7743055555555555 | 51.951 |
| 0.775 | 51.951 |
| 0.7756944444444445 | 51.951 |
| 0.7763888888888889 | 51.951 |
| 0.7770833333333332 | 47.511 |
| 0.7777777777777778 | 47.511 |
| 0.7784722222222222 | 47.511 |
| 0.7791666666666667 | 47.511 |
| 0.779861111111111 | 47.511 |
| 0.7805555555555556 | 47.511 |
| 0.78125 | 47.511 |
| 0.7819444444444444 | 43.079 |
| 0.782638888888889 | 43.079 |
| 0.7833333333333333 | 43.079 |
| 0.7840277777777778 | 43.079 |
| 0.7847222222222222 | 43.079 |
| 0.7854166666666668 | 38.653 |
| 0.7861111111111111 | 38.653 |
| 0.7868055555555555 | 38.653 |
| 0.7875 | 38.653 |
| 0.7881944444444445 | 38.653 |
| 0.7888888888888889 | 38.653 |
| 0.7895833333333333 | 38.653 |
| 0.7902777777777777 | 38.653 |
| 0.7909722222222223 | 34.234 |
| 0.7916666666666666 | 34.234 |
| 0.7923611111111111 | 34.234 |
| 0.7930555555555556 | 34.234 |
| 0.7937500000000001 | 34.234 |
| 0.7944444444444444 | 34.234 |
| 0.7951388888888888 | 34.234 |
| 0.7958333333333334 | 29.823 |
| 0.7965277777777778 | 34.234 |
| 0.7972222222222222 | 29.823 |
| 0.7979166666666666 | 29.823 |
| 0.7986111111111112 | 29.823 |
| 0.7993055555555556 | 29.823 |
| 0.7999999999999999 | 29.823 |
| 0.8006944444444444 | 29.823 |
| 0.8013888888888889 | 29.823 |
| 0.8020833333333334 | 29.823 |
| 0.8027777777777777 | 29.823 |
| 0.8034722222222223 | 29.823 |
| 0.8041666666666667 | 25.419 |
| 0.8048611111111111 | 25.419 |
| 0.8055555555555555 | 25.419 |
| 0.80625 | 25.419 |
| 0.8069444444444445 | 25.419 |
| 0.8076388888888889 | 25.419 |
| 0.8083333333333332 | 25.419 |
| 0.8090277777777778 | 25.419 |
| 0.8097222222222222 | 21.024 |
| 0.8104166666666667 | 21.024 |
| 0.811111111111111 | 21.024 |
| 0.8118055555555556 | 21.024 |
| 0.8125 | 21.024 |
| 0.8131944444444444 | 16.636 |
| 0.813888888888889 | 16.636 |
| 0.8145833333333333 | 12.257 |
| 0.8152777777777778 | 12.257 |
| 0.8159722222222222 | 12.257 |
| 0.8166666666666668 | 12.257 |
| 0.8173611111111111 | 12.257 |
| 0.8180555555555555 | 12.257 |
| 0.81875 | 12.257 |
| 0.8194444444444445 | 7.887 |
| 0.8201388888888889 | 7.887 |
| 0.8208333333333333 | 7.887 |
| 0.8215277777777777 | 7.887 |
| 0.8222222222222223 | 7.887 |
| 0.8229166666666666 | 7.887 |
| 0.8236111111111111 | 7.887 |
| 0.8243055555555556 | 7.887 |
| 0.8250000000000001 | 7.887 |
| 0.8256944444444444 | 7.887 |
| 0.8263888888888888 | 7.887 |
| 0.8270833333333334 | 7.887 |
| 0.8277777777777778 | 7.887 |
| 0.8284722222222222 | 7.887 |
| 0.8291666666666666 | 3.525 |
| 0.8298611111111112 | 3.525 |
| 0.8305555555555556 | 3.525 |
| 0.8312499999999999 | 3.525 |
| 0.8319444444444444 | 3.525 |
| 0.8326388888888889 | 3.525 |
| 0.8333333333333334 | 3.525 |
| 0.8340277777777777 | 3.525 |
| 0.8347222222222223 | 3.525 |
| 0.8354166666666667 | 3.525 |
| 0.8361111111111111 | 0 |
| 0.8368055555555555 | 0 |
| 0.8375 | 0 |
| 0.8381944444444445 | 0 |
| 0.8388888888888889 | 0 |
| 0.8395833333333332 | 0 |
| 0.8402777777777778 | 0 |
| 0.8409722222222222 | 0 |
| 0.8416666666666667 | 0 |
| 0.842361111111111 | 0 |
| 0.8430555555555556 | 0 |
| 0.84375 | 0 |
| 0.8444444444444444 | 0 |
| 0.845138888888889 | 0 |
| 0.8458333333333333 | 0 |
| 0.8465277777777778 | 0 |
| 0.8472222222222222 | 0 |
| 0.8479166666666668 | 0 |
| 0.8486111111111111 | 0 |
| 0.8493055555555555 | 0 |
| 0.85 | 0 |
| 0.8506944444444445 | 0 |
| 0.8513888888888889 | 0 |
| 0.8520833333333333 | 0 |
| 0.8527777777777777 | 0 |
| 0.8534722222222223 | 0 |
| 0.8541666666666666 | 0 |
| 0.8548611111111111 | 0 |
| 0.8555555555555556 | 0 |
| 0.8562500000000001 | 0 |
| 0.8569444444444444 | 0 |
| 0.8576388888888888 | 0 |
| 0.8583333333333334 | 0 |
| 0.8590277777777778 | 0 |
| 0.8597222222222222 | 0 |
| 0.8604166666666666 | 0 |
| 0.8611111111111112 | 0 |
| 0.8618055555555556 | 0 |
| 0.8624999999999999 | 0 |
| 0.8631944444444444 | 0 |
| 0.8638888888888889 | 0 |
| 0.8645833333333334 | 0 |
| 0.8652777777777777 | 0 |
| 0.8659722222222223 | 0 |
| 0.8666666666666667 | 0 |
| 0.8673611111111111 | 0 |
| 0.8680555555555555 | 0 |
| 0.86875 | 0 |
| 0.8694444444444445 | 0 |
| 0.8701388888888889 | 0 |
| 0.8708333333333332 | 0 |
| 0.8715277777777778 | 0 |
| 0.8722222222222222 | 0 |
| 0.8729166666666667 | 0 |
| 0.873611111111111 | 0 |
| 0.8743055555555556 | 0 |
| 0.875 | 0 |
| 0.8756944444444444 | 0 |
| 0.876388888888889 | 0 |
| 0.8770833333333333 | 0 |
| 0.8777777777777778 | 0 |
| 0.8784722222222222 | 0 |
| 0.8791666666666668 | 0 |
| 0.8798611111111111 | 0 |
| 0.8805555555555555 | 0 |
| 0.88125 | 0 |
| 0.8819444444444445 | 0 |
| 0.8826388888888889 | 0 |
| 0.8833333333333333 | 0 |
| 0.8840277777777777 | 0 |
| 0.8847222222222223 | 0 |
| 0.8854166666666666 | 0 |
| 0.8861111111111111 | 0 |
| 0.8868055555555556 | 0 |
| 0.8875000000000001 | 0 |
| 0.8881944444444444 | 0 |
| 0.8888888888888888 | 0 |
| 0.8895833333333334 | 0 |
| 0.8902777777777778 | 0 |
| 0.8909722222222222 | 0 |
| 0.8916666666666666 | 0 |
| 0.8923611111111112 | 0 |
| 0.8930555555555556 | 0 |
| 0.8937499999999999 | 0 |
| 0.8944444444444444 | 0 |
| 0.8951388888888889 | 0 |
| 0.8958333333333334 | 0 |
| 0.8965277777777777 | 0 |
| 0.8972222222222223 | 0 |
| 0.8979166666666667 | 0 |
| 0.8986111111111111 | 0 |
| 0.8993055555555555 | 0 |
| 0.9 | 0 |
| 0.9006944444444445 | 0 |
| 0.9013888888888889 | 0 |
| 0.9020833333333332 | 0 |
| 0.9027777777777778 | 0 |
| 0.9034722222222222 | 0 |
| 0.9041666666666667 | 0 |
| 0.904861111111111 | 0 |
| 0.9055555555555556 | 0 |
| 0.90625 | 0 |
| 0.9069444444444444 | 0 |
| 0.907638888888889 | 0 |
| 0.9083333333333333 | 0 |
| 0.9090277777777778 | 0 |
| 0.9097222222222222 | 0 |
| 0.9104166666666668 | 0 |
| 0.9111111111111111 | 0 |
| 0.9118055555555555 | 0 |
| 0.9125 | 0 |
| 0.9131944444444445 | 0 |
| 0.9138888888888889 | 0 |
| 0.9145833333333333 | 0 |
| 0.9152777777777777 | 0 |
| 0.9159722222222223 | 0 |
| 0.9166666666666666 | 0 |
| 0.9173611111111111 | 0 |
| 0.9180555555555556 | 0 |
| 0.9187500000000001 | 0 |
| 0.9194444444444444 | 0 |
| 0.9201388888888888 | 0 |
| 0.9208333333333334 | 0 |
| 0.9215277777777778 | 0 |
| 0.9222222222222222 | 0 |
| 0.9229166666666666 | 0 |
| 0.9236111111111112 | 0 |
| 0.9243055555555556 | 0 |
| 0.9249999999999999 | 0 |
| 0.9256944444444444 | 0 |
| 0.9263888888888889 | 0 |
| 0.9270833333333334 | 0 |
| 0.9277777777777777 | 0 |
| 0.9284722222222223 | 0 |
| 0.9291666666666667 | 0 |
| 0.9298611111111111 | 0 |
| 0.9305555555555555 | 0 |
| 0.93125 | 0 |
| 0.9319444444444445 | 0 |
| 0.9326388888888889 | 0 |
| 0.9333333333333332 | 0 |
| 0.9340277777777778 | 0 |
| 0.9347222222222222 | 0 |
| 0.9354166666666667 | 0 |
| 0.936111111111111 | 0 |
| 0.9368055555555556 | 0 |
| 0.9375 | 0 |
| 0.9381944444444444 | 0 |
| 0.938888888888889 | 0 |
| 0.9395833333333333 | 0 |
| 0.9402777777777778 | 0 |
| 0.9409722222222222 | 0 |
| 0.9416666666666668 | 0 |
| 0.9423611111111111 | 0 |
| 0.9430555555555555 | 0 |
| 0.94375 | 0 |
| 0.9444444444444445 | 0 |
| 0.9451388888888889 | 0 |
| 0.9458333333333333 | 0 |
| 0.9465277777777777 | 0 |
| 0.9472222222222223 | 0 |
| 0.9479166666666666 | 0 |
| 0.9486111111111111 | 0 |
| 0.9493055555555556 | 0 |
| 0.9500000000000001 | 0 |
| 0.9506944444444444 | 0 |
| 0.9513888888888888 | 0 |
| 0.9520833333333334 | 0 |
| 0.9527777777777778 | 0 |
| 0.9534722222222222 | 0 |
| 0.9541666666666666 | 0 |
| 0.9548611111111112 | 0 |
| 0.9555555555555556 | 0 |
| 0.9562499999999999 | 0 |
| 0.9569444444444444 | 0 |
| 0.9576388888888889 | 0 |
| 0.9583333333333334 | 0 |
| 0.9590277777777777 | 0 |
| 0.9597222222222223 | 0 |
| 0.9604166666666667 | 0 |
| 0.9611111111111111 | 0 |
| 0.9618055555555555 | 0 |
| 0.9625 | 0 |
| 0.9631944444444445 | 0 |
| 0.9638888888888889 | 0 |
| 0.9645833333333332 | 0 |
| 0.9652777777777778 | 0 |
| 0.9659722222222222 | 0 |
| 0.9666666666666667 | 0 |
| 0.967361111111111 | 0 |
| 0.9680555555555556 | 0 |
| 0.96875 | 0 |
| 0.9694444444444444 | 0 |
| 0.970138888888889 | 0 |
| 0.9708333333333333 | 0 |
| 0.9715277777777778 | 0 |
| 0.9722222222222222 | 0 |
| 0.9729166666666668 | 0 |
| 0.9736111111111111 | 0 |
| 0.9743055555555555 | 0 |
| 0.975 | 0 |
| 0.9756944444444445 | 0 |
| 0.9763888888888889 | 0 |
| 0.9770833333333333 | 0 |
| 0.9777777777777777 | 0 |
| 0.9784722222222223 | 0 |
| 0.9791666666666666 | 0 |
| 0.9798611111111111 | 0 |
| 0.9805555555555556 | 0 |
| 0.9812500000000001 | 0 |
| 0.9819444444444444 | 0 |
| 0.9826388888888888 | 0 |
| 0.9833333333333334 | 0 |
| 0.9840277777777778 | 0 |
| 0.9847222222222222 | 0 |
| 0.9854166666666666 | 0 |
| 0.9861111111111112 | 0 |
| 0.9868055555555556 | 0 |
| 0.9874999999999999 | 0 |
| 0.9881944444444444 | 0 |
| 0.9888888888888889 | 0 |
| 0.9895833333333334 | 0 |
| 0.9902777777777777 | 0 |
| 0.9909722222222223 | 0 |
| 0.9916666666666667 | 0 |
| 0.9923611111111111 | 0 |
| 0.9930555555555555 | 0 |
| 0.99375 | 0 |
| 0.9944444444444445 | 0 |
| 0.9951388888888889 | 0 |
| 0.9958333333333332 | 0 |
| 0.9965277777777778 | 0 |
| 0.9972222222222222 | 0 |
| 0.9979166666666667 | 0 |
| 0.998611111111111 | 0 |
| 0.9993055555555556 | 0 |